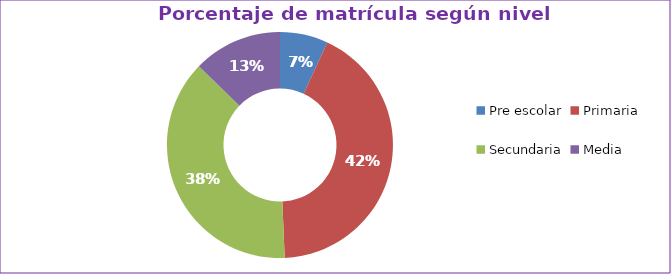
| Category | Series 0 |
|---|---|
| Pre escolar | 0.069 |
| Primaria | 0.425 |
| Secundaria | 0.379 |
| Media | 0.127 |